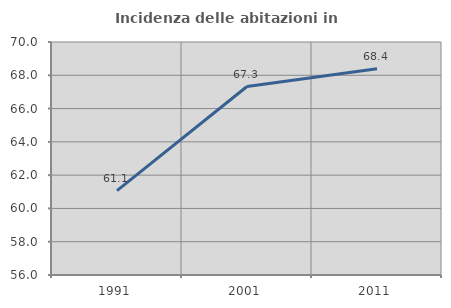
| Category | Incidenza delle abitazioni in proprietà  |
|---|---|
| 1991.0 | 61.07 |
| 2001.0 | 67.325 |
| 2011.0 | 68.395 |